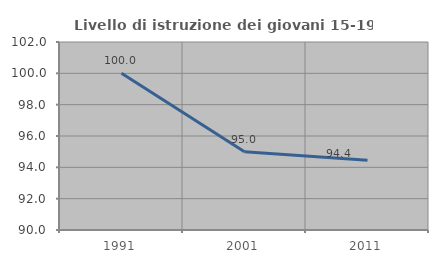
| Category | Livello di istruzione dei giovani 15-19 anni |
|---|---|
| 1991.0 | 100 |
| 2001.0 | 95 |
| 2011.0 | 94.444 |